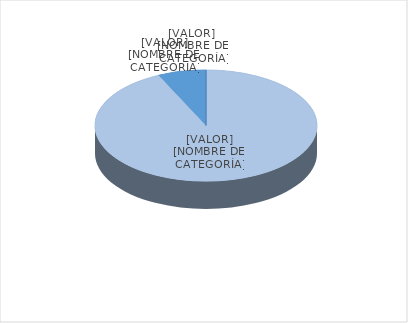
| Category | Series 0 |
|---|---|
| PRESUPUESTO VIGENTE PARA 2024 | 31000000 |
| PRESUPUESTO EJECUTADO  | 2339444.92 |
| PORCENTAJE DE EJECUCIÓN  | 0.076 |